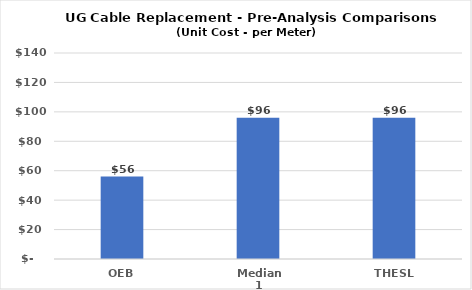
| Category | Series 0 |
|---|---|
| OEB | 56 |
| Median 1 | 96.025 |
| THESL | 96 |